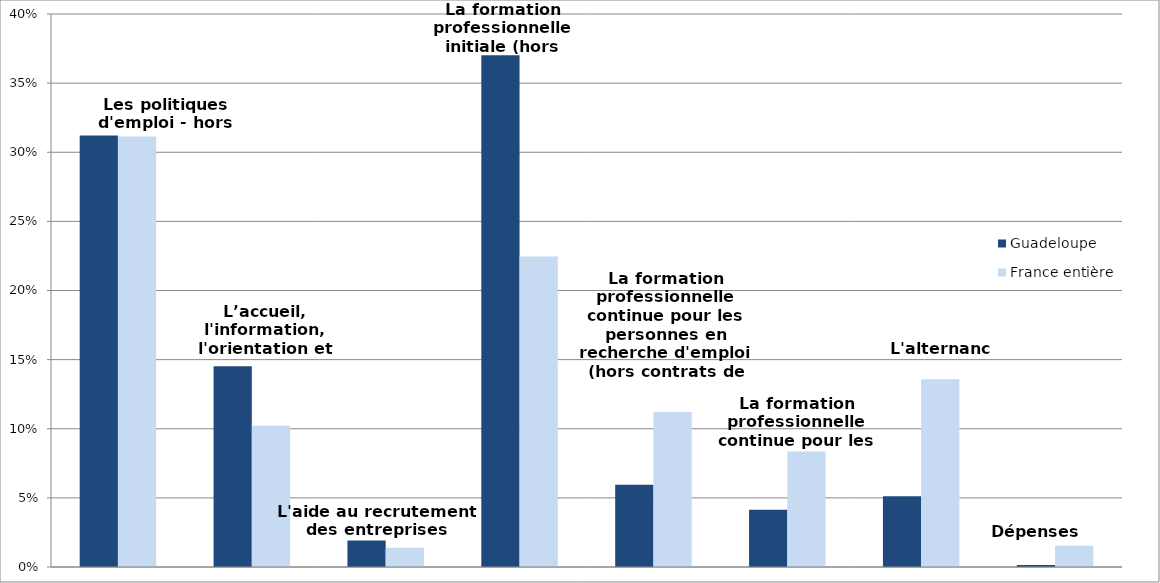
| Category | Guadeloupe | France entière |
|---|---|---|
| Les politiques d'emploi - hors mesures zonées | 0.312 | 0.311 |
| L’accueil, l'information, l'orientation et l'accompagnement | 0.145 | 0.102 |
| L'aide au recrutement des entreprises | 0.019 | 0.014 |
| La formation professionnelle initiale (hors apprentissage) | 0.37 | 0.225 |
| La formation professionnelle continue pour les personnes en recherche d'emploi (hors contrats de professionnalisation) | 0.059 | 0.112 |
| La formation professionnelle continue pour les actifs occupés | 0.041 | 0.084 |
| L'alternance | 0.051 | 0.136 |
| Dépenses non-ventilables | 0.001 | 0.015 |